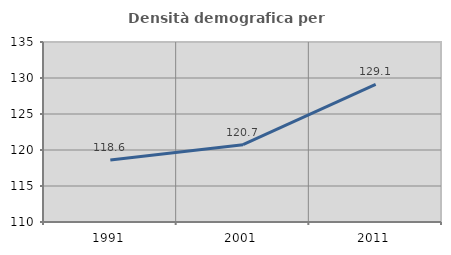
| Category | Densità demografica |
|---|---|
| 1991.0 | 118.599 |
| 2001.0 | 120.738 |
| 2011.0 | 129.127 |